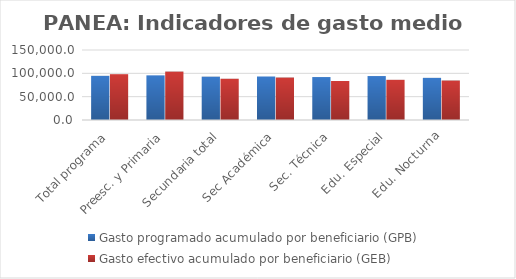
| Category | Gasto programado acumulado por beneficiario (GPB)  | Gasto efectivo acumulado por beneficiario (GEB)  |
|---|---|---|
| Total programa | 94629.135 | 98160.218 |
| Preesc. y Primaria | 95665.074 | 103733.152 |
| Secundaria total | 92830.908 | 88382.491 |
| Sec Académica | 93224.129 | 90976.066 |
| Sec. Técnica | 92039.871 | 83629.687 |
| Edu. Especial | 94190.238 | 86113.086 |
| Edu. Nocturna | 90319.074 | 84581.877 |